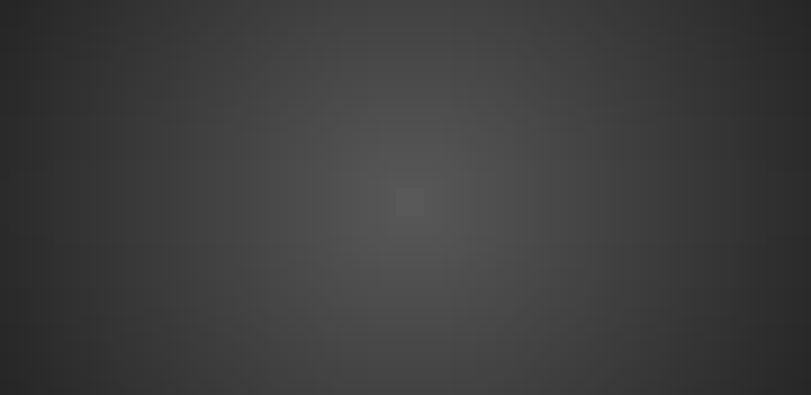
| Category | Total |
|---|---|
| 30.26 - Material Elétrico | 7164.2 |
| 30.42 - Ferramentas | 861.59 |